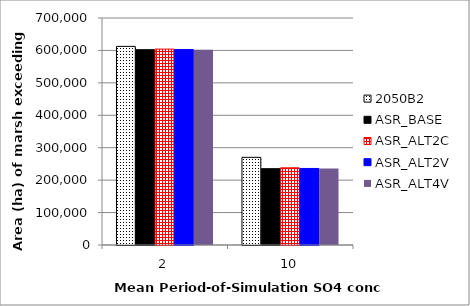
| Category | 2050B2 | ASR_BASE | ASR_ALT2C | ASR_ALT2V | ASR_ALT4V |
|---|---|---|---|---|---|
| 2.0 | 612475 | 602275 | 604125 | 602550 | 602375 |
| 10.0 | 270325 | 235400 | 238050 | 236025 | 235625 |